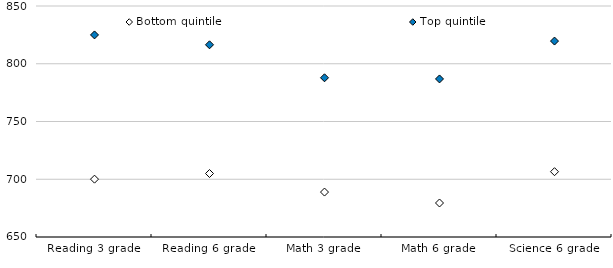
| Category | Bottom quintile | Top quintile |
|---|---|---|
| Reading 3 grade | 700.09 | 824.95 |
| Reading 6 grade | 704.96 | 816.4 |
| Math 3 grade | 688.92 | 787.84 |
| Math 6 grade | 679.44 | 786.84 |
| Science 6 grade | 706.54 | 819.65 |